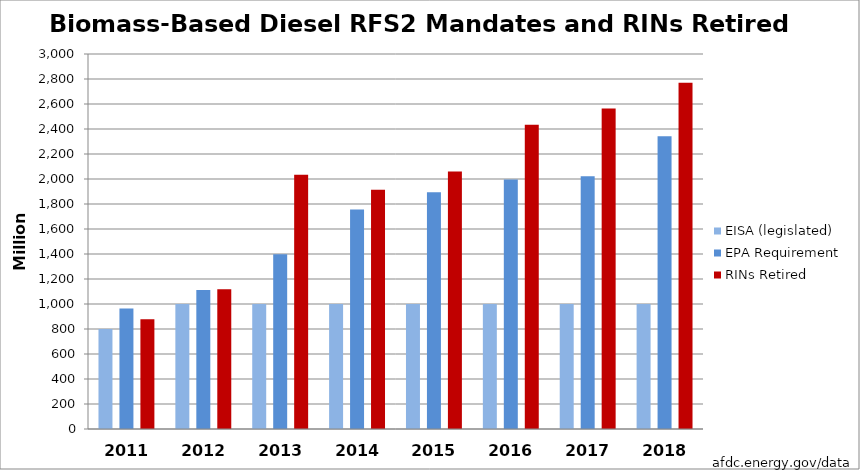
| Category | EISA (legislated) | EPA Requirement | RINs Retired |
|---|---|---|---|
| 2011.0 | 800 | 965 | 879 |
| 2012.0 | 1000 | 1113 | 1119 |
| 2013.0 | 1000 | 1399 | 2035 |
| 2014.0 | 1000 | 1757 | 1915 |
| 2015.0 | 1000 | 1895 | 2061 |
| 2016.0 | 1000 | 1996 | 2435 |
| 2017.0 | 1000 | 2023 | 2564 |
| 2018.0 | 1000 | 2343 | 2770 |